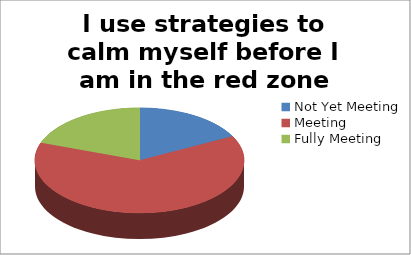
| Category | I use strategies to calm myself before I am in the red zone |
|---|---|
| Not Yet Meeting | 8 |
| Meeting | 29 |
| Fully Meeting | 9 |